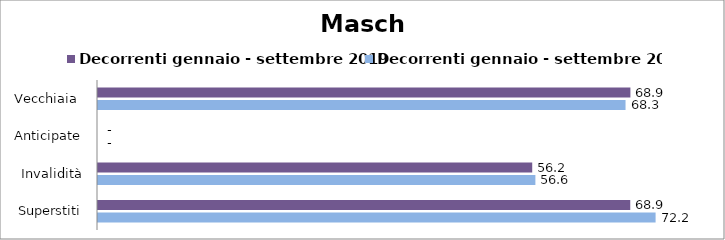
| Category | Decorrenti gennaio - settembre 2019 | Decorrenti gennaio - settembre 2020 |
|---|---|---|
| Vecchiaia  | 68.92 | 68.29 |
|  Anticipate | 0 | 0 |
| Invalidità | 56.21 | 56.62 |
| Superstiti | 68.9 | 72.18 |